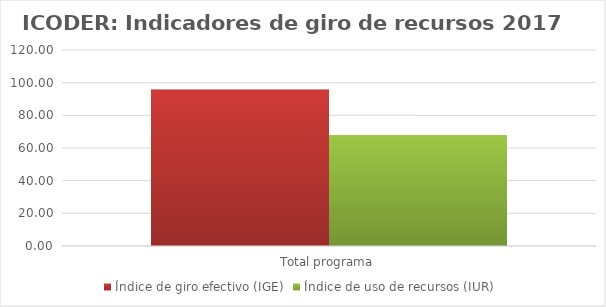
| Category | Índice de giro efectivo (IGE) | Índice de uso de recursos (IUR)  |
|---|---|---|
| Total programa | 95.787 | 67.941 |